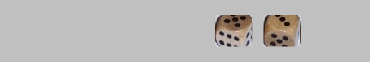
| Category | 1 | 2 | 3 | 4 | 5 | 6 |
|---|---|---|---|---|---|---|
|  | 0 | 0 | 0 | 0 | 0 | 0 |
|  | 0 | 0 | 0 | 0 | 0 | 0 |
|  | 0 | 0 | 0 | 0 | 0 | 0 |
|  | 0 | 0 | 0 | 0 | 0 | 0 |
| 5 | 0 | 0 | 0 | 0 | 1 | 0 |
| 3 | 0 | 0 | 1 | 0 | 0 | 0 |